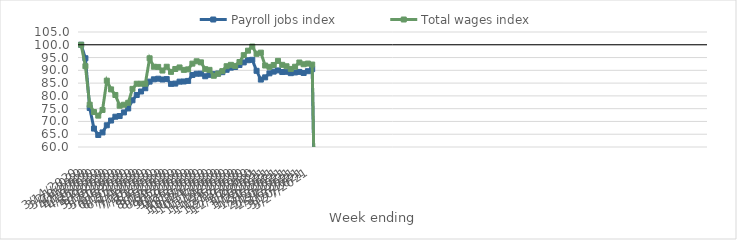
| Category | Payroll jobs index | Total wages index |
|---|---|---|
| 14/03/2020 | 100 | 100 |
| 21/03/2020 | 94.731 | 91.622 |
| 28/03/2020 | 75.284 | 76.554 |
| 04/04/2020 | 67.212 | 73.689 |
| 11/04/2020 | 64.699 | 72.273 |
| 18/04/2020 | 65.7 | 74.487 |
| 25/04/2020 | 68.495 | 85.96 |
| 02/05/2020 | 70.352 | 82.539 |
| 09/05/2020 | 71.85 | 80.36 |
| 16/05/2020 | 72.12 | 76.152 |
| 23/05/2020 | 73.528 | 76.534 |
| 30/05/2020 | 75.086 | 77.296 |
| 06/06/2020 | 78.287 | 82.751 |
| 13/06/2020 | 80.363 | 84.758 |
| 20/06/2020 | 81.723 | 84.758 |
| 27/06/2020 | 82.994 | 84.759 |
| 04/07/2020 | 85.59 | 94.714 |
| 11/07/2020 | 86.481 | 91.414 |
| 18/07/2020 | 86.724 | 91.336 |
| 25/07/2020 | 86.405 | 89.918 |
| 01/08/2020 | 86.572 | 91.404 |
| 08/08/2020 | 84.696 | 89.397 |
| 15/08/2020 | 84.812 | 90.524 |
| 22/08/2020 | 85.575 | 91.131 |
| 29/08/2020 | 85.632 | 90.182 |
| 05/09/2020 | 85.86 | 90.376 |
| 12/09/2020 | 88.166 | 92.621 |
| 19/09/2020 | 88.673 | 93.541 |
| 26/09/2020 | 88.706 | 93.124 |
| 03/10/2020 | 87.682 | 90.456 |
| 10/10/2020 | 88.229 | 90.184 |
| 17/10/2020 | 88.513 | 87.882 |
| 24/10/2020 | 88.737 | 88.68 |
| 31/10/2020 | 89.285 | 89.687 |
| 07/11/2020 | 90.206 | 91.61 |
| 14/11/2020 | 91.051 | 92.15 |
| 21/11/2020 | 91.299 | 91.728 |
| 28/11/2020 | 92.084 | 93.264 |
| 05/12/2020 | 93.099 | 95.927 |
| 12/12/2020 | 93.95 | 97.698 |
| 19/12/2020 | 94.111 | 99.307 |
| 26/12/2020 | 89.808 | 96.459 |
| 02/01/2021 | 86.384 | 96.921 |
| 09/01/2021 | 87.252 | 91.884 |
| 16/01/2021 | 88.824 | 91.353 |
| 23/01/2021 | 89.494 | 92.098 |
| 30/01/2021 | 89.967 | 93.695 |
| 06/02/2021 | 89.341 | 92.15 |
| 13/02/2021 | 89.42 | 91.592 |
| 20/02/2021 | 88.891 | 90.554 |
| 27/02/2021 | 89.167 | 91.409 |
| 06/03/2021 | 89.38 | 93.064 |
| 13/03/2021 | 88.962 | 92.376 |
| 20/03/2021 | 89.658 | 92.646 |
| 27/03/2021 | 90.462 | 92.262 |